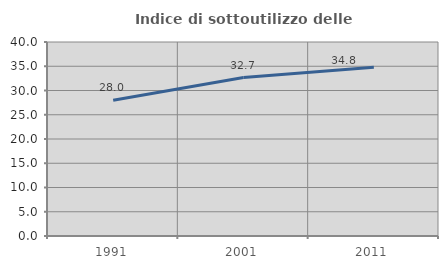
| Category | Indice di sottoutilizzo delle abitazioni  |
|---|---|
| 1991.0 | 27.988 |
| 2001.0 | 32.68 |
| 2011.0 | 34.811 |